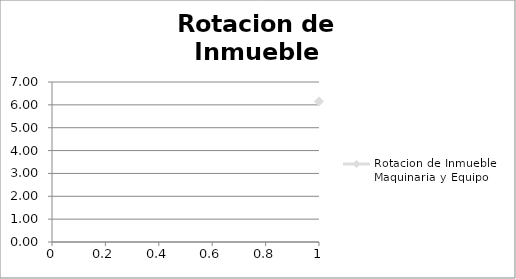
| Category | Rotacion de Inmueble Maquinaria y Equipo |
|---|---|
| 0 | 6.149 |
| 1 | 4.099 |
| 2 | 6.149 |
| 3 | 6.149 |
| 4 | 6.149 |
| 5 | 6.149 |
| 6 | 6.149 |
| 7 | 6.149 |